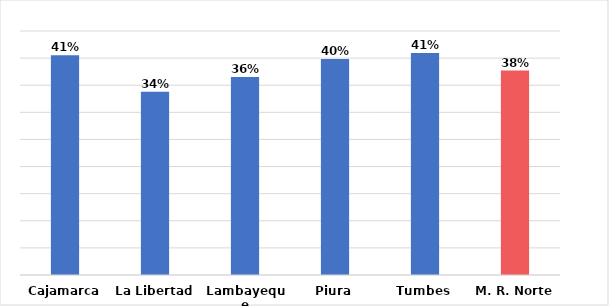
| Category | Series 0 |
|---|---|
| Cajamarca | 0.405 |
| La Libertad | 0.338 |
| Lambayeque | 0.365 |
| Piura | 0.399 |
| Tumbes | 0.409 |
| M. R. Norte | 0.377 |